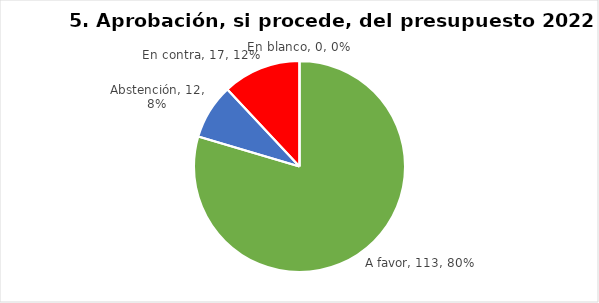
| Category | Series 0 |
|---|---|
| A favor | 113 |
| Abstención | 12 |
| En contra | 17 |
| En blanco | 0 |